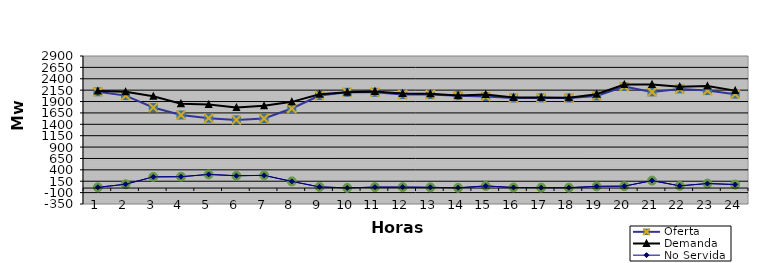
| Category | Oferta | No Servida | Demanda |
|---|---|---|---|
| 1.0 | 2113.58 | 16.068 | 2129.648 |
| 2.0 | 2029.77 | 84.04 | 2113.81 |
| 3.0 | 1768.4 | 245.969 | 2014.369 |
| 4.0 | 1604.47 | 249.243 | 1853.713 |
| 5.0 | 1533.62 | 299.405 | 1833.025 |
| 6.0 | 1496.96 | 270.368 | 1767.328 |
| 7.0 | 1526.71 | 278.8 | 1805.51 |
| 8.0 | 1747.2 | 145.95 | 1893.15 |
| 9.0 | 2032.03 | 25.511 | 2057.541 |
| 10.0 | 2102.39 | 3.43 | 2105.82 |
| 11.0 | 2101.86 | 20.9 | 2122.76 |
| 12.0 | 2054.83 | 20.9 | 2075.73 |
| 13.0 | 2053.27 | 15.91 | 2069.18 |
| 14.0 | 2027.66 | 5.716 | 2033.376 |
| 15.0 | 2010.16 | 46.603 | 2056.763 |
| 16.0 | 1977.55 | 12.994 | 1990.544 |
| 17.0 | 1979.95 | 9.105 | 1989.055 |
| 18.0 | 1977.6 | 8.1 | 1985.7 |
| 19.0 | 2022.39 | 38.04 | 2060.43 |
| 20.0 | 2230.05 | 42.067 | 2272.117 |
| 21.0 | 2111.3 | 163.389 | 2274.689 |
| 22.0 | 2177.25 | 48.691 | 2225.941 |
| 23.0 | 2140.83 | 99.531 | 2240.361 |
| 24.0 | 2062.59 | 77.25 | 2139.84 |